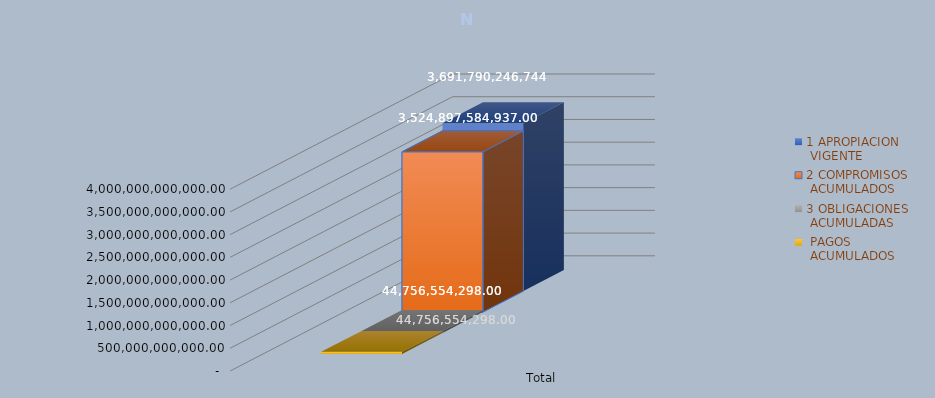
| Category | 1 APROPIACION
 VIGENTE | 2 COMPROMISOS
 ACUMULADOS | 3 OBLIGACIONES
 ACUMULADAS |  PAGOS
 ACUMULADOS |
|---|---|---|---|---|
| Total | 3691790246744 | 3524897584937 | 44756554298 | 44756554298 |